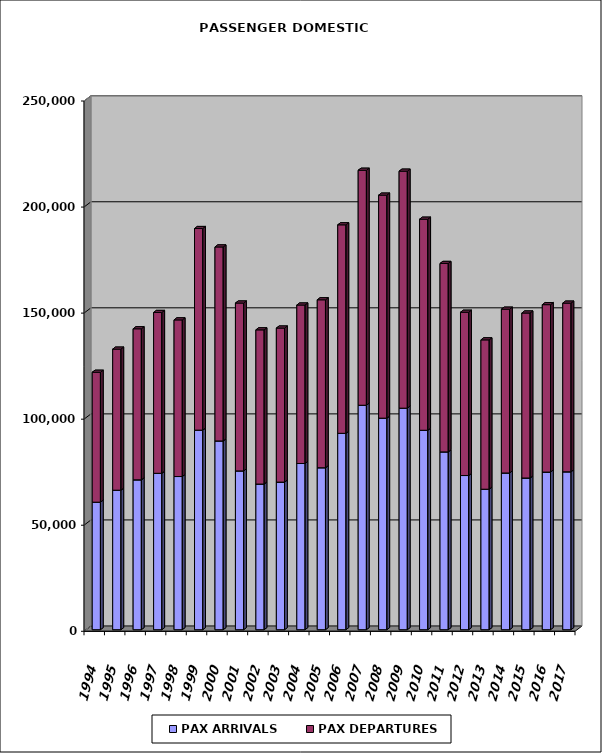
| Category | PAX ARRIVALS | PAX DEPARTURES |
|---|---|---|
| 1994.0 | 60122 | 61248 |
| 1995.0 | 65769 | 66500 |
| 1996.0 | 70656 | 71208 |
| 1997.0 | 73734 | 75830 |
| 1998.0 | 72216 | 73840 |
| 1999.0 | 94085 | 95047 |
| 2000.0 | 88999 | 91447 |
| 2001.0 | 74864 | 79140 |
| 2002.0 | 68674 | 72688 |
| 2003.0 | 69584 | 72628 |
| 2004.0 | 78360 | 74707 |
| 2005.0 | 76355 | 79179 |
| 2006.0 | 92586 | 98293 |
| 2007.0 | 105823 | 110782 |
| 2008.0 | 99732 | 105141 |
| 2009.0 | 104440 | 111734 |
| 2010.0 | 94025 | 99505 |
| 2011.0 | 83834 | 88838 |
| 2012.0 | 72686 | 76978 |
| 2013.0 | 66230 | 70411 |
| 2014.0 | 73886 | 77221 |
| 2015.0 | 71520 | 77782 |
| 2016.0 | 74314 | 78926 |
| 2017.0 | 74434 | 79519 |